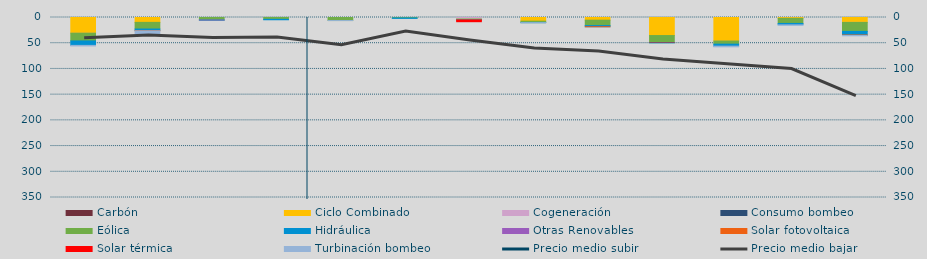
| Category | Carbón | Ciclo Combinado | Cogeneración | Consumo bombeo | Eólica | Hidráulica | Otras Renovables | Solar fotovoltaica | Solar térmica | Turbinación bombeo |
|---|---|---|---|---|---|---|---|---|---|---|
| 0 |  | 30277.5 | 252.2 |  | 15007.3 | 8686.8 | 0 | 0 | 0 | 1087 |
| 1 |  | 9485.3 | 0 |  | 12915.2 | 2939 | 429 | 195.7 | 0 | 5519 |
| 2 |  | 0 | 0 |  | 4917.9 | 180 | 1584 | 0 | 30 | 0 |
| 3 |  | 0 | 0 |  | 3561.7 | 841.9 | 0 | 0 | 0 | 0 |
| 4 |  | 0 | 0 |  | 5915.7 | 0 | 0 | 0 | 9 | 13.3 |
| 5 |  | 0 | 0 |  | 896.1 | 816.9 | 0 | 0 | 0 | 0 |
| 6 |  | 0 | 2906.3 |  | 948.1 | 1031.9 | 0 | 118.2 | 5112.9 | 0 |
| 7 |  | 7210.3 | 0 |  | 2761 | 7 | 0 | 0 | 0 | 143.6 |
| 8 |  | 5171.1 | 60 |  | 10463.2 | 2268.1 | 0 | 62.8 | 139.2 | 0 |
| 9 |  | 35080.5 | 0 |  | 13742.9 | 373 | 0 | 0 | 885.1 | 0 |
| 10 |  | 45653 | 130.2 |  | 6042.2 | 3888 | 0 | 0 | 0 | 1300 |
| 11 |  | 1436.8 | 180 |  | 9933.5 | 2555.1 | 260 | 0 | 0 | 330 |
| 12 |  | 9373.3 | 187.6 |  | 17462.5 | 7017.6 | 0 | 881.5 | 0 | 630 |